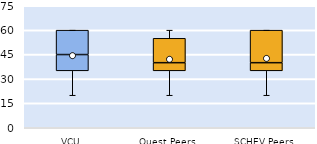
| Category | 25th | 50th | 75th |
|---|---|---|---|
| VCU | 35 | 10 | 15 |
| Quest Peers | 35 | 5 | 15 |
| SCHEV Peers | 35 | 5 | 20 |